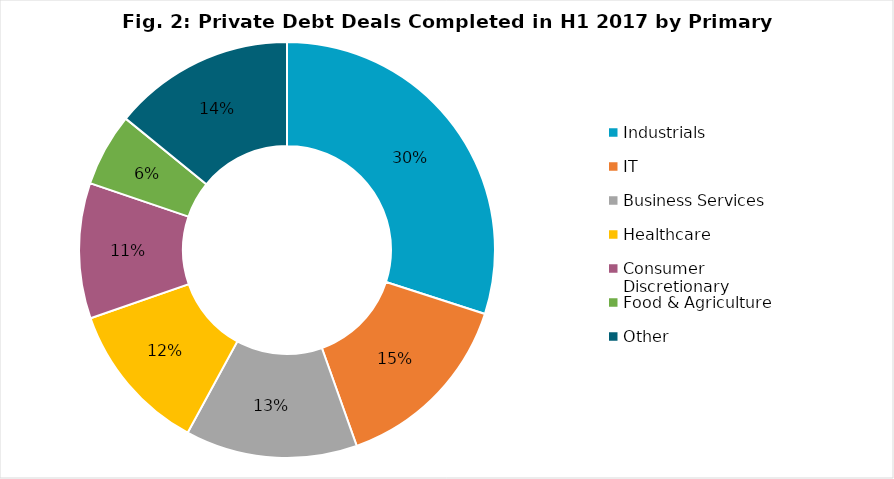
| Category | Series 0 |
|---|---|
| Industrials | 0.297 |
| IT | 0.145 |
| Business Services | 0.133 |
| Healthcare | 0.116 |
| Consumer Discretionary | 0.104 |
| Food & Agriculture | 0.056 |
| Other | 0.14 |